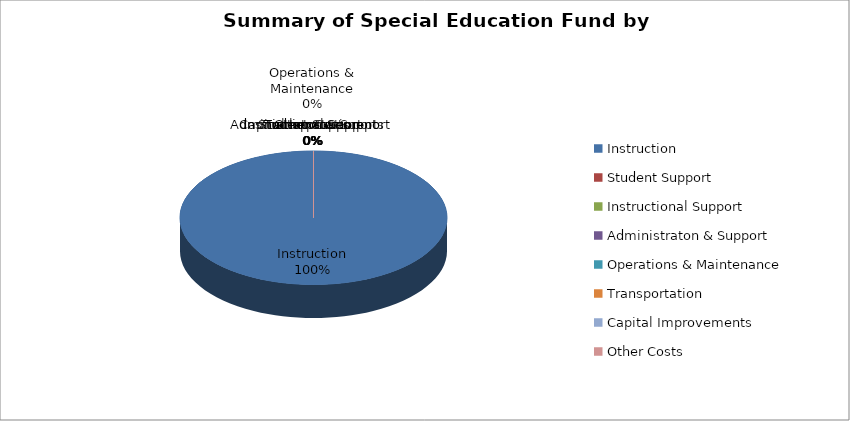
| Category | 2018-2019 |
|---|---|
| Instruction | 252275 |
| Student Support | 0 |
| Instructional Support | 0 |
| Administraton & Support | 0 |
| Operations & Maintenance | 0 |
| Transportation | 0 |
| Capital Improvements | 0 |
| Other Costs | 0 |